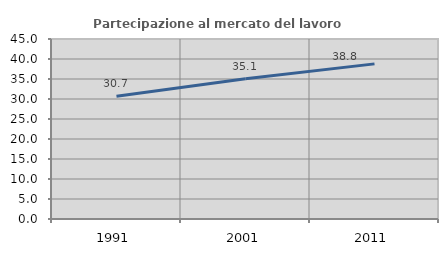
| Category | Partecipazione al mercato del lavoro  femminile |
|---|---|
| 1991.0 | 30.702 |
| 2001.0 | 35.053 |
| 2011.0 | 38.78 |